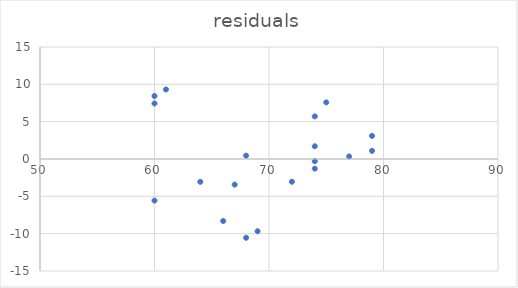
| Category | residuals |
|---|---|
| 74.0 | -0.292 |
| 79.0 | 1.091 |
| 77.0 | 0.338 |
| 60.0 | 8.436 |
| 72.0 | -3.045 |
| 74.0 | 1.708 |
| 74.0 | 5.708 |
| 66.0 | -8.304 |
| 68.0 | 0.449 |
| 64.0 | -3.058 |
| 60.0 | -5.564 |
| 79.0 | 3.091 |
| 60.0 | 7.436 |
| 74.0 | -1.292 |
| 69.0 | -9.675 |
| 61.0 | 9.313 |
| 75.0 | 7.585 |
| 67.0 | -3.428 |
| 68.0 | -10.551 |